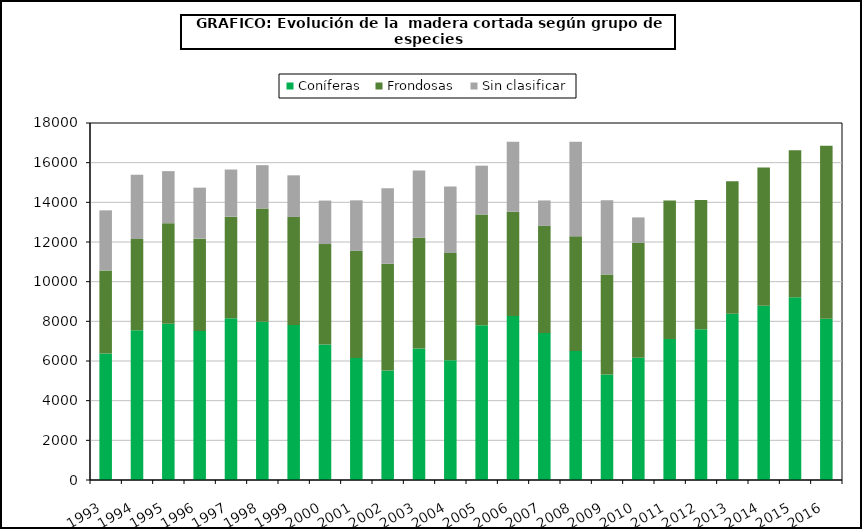
| Category | Coníferas | Frondosas | Sin clasificar |
|---|---|---|---|
| 1993.0 | 6372 | 4197 | 3027 |
| 1994.0 | 7549 | 4601 | 3244 |
| 1995.0 | 7882 | 5068 | 2623 |
| 1996.0 | 7507 | 4662 | 2571 |
| 1997.0 | 8160 | 5116 | 2378 |
| 1998.0 | 7981 | 5710 | 2183 |
| 1999.0 | 7816 | 5447 | 2099 |
| 2000.0 | 6838 | 5058 | 2193 |
| 2001.0 | 6148 | 5407 | 2546 |
| 2002.0 | 5525 | 5382 | 3806 |
| 2003.0 | 6631 | 5582 | 3396 |
| 2004.0 | 6037 | 5409 | 3353 |
| 2005.0 | 7804 | 5578 | 2466 |
| 2006.0 | 8270 | 5260 | 3523 |
| 2007.0 | 7406 | 5408 | 1281 |
| 2008.0 | 6501 | 5788 | 4761 |
| 2009.0 | 5318 | 5038 | 3754.288 |
| 2010.0 | 6163.941 | 5787.672 | 1287.882 |
| 2011.0 | 7115.03 | 6977.661 | 0 |
| 2012.0 | 7598.388 | 6520.861 | 0 |
| 2013.0 | 8378.464 | 6681.31 | 0 |
| 2014.0 | 8779.452 | 6982.438 | 0 |
| 2015.0 | 9218.396 | 7411.416 | 0 |
| 2016.0 | 8134.565 | 8713.252 | 0 |